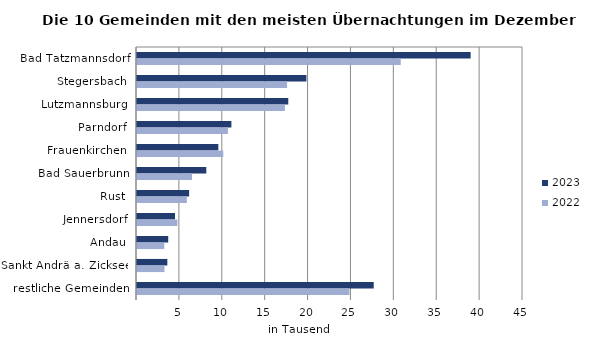
| Category | 2023 | 2022 |
|---|---|---|
| Bad Tatzmannsdorf | 38897 | 30749 |
| Stegersbach | 19749 | 17498 |
| Lutzmannsburg | 17636 | 17246 |
| Parndorf | 11005 | 10603 |
| Frauenkirchen | 9483 | 10058 |
| Bad Sauerbrunn | 8079 | 6413 |
| Rust | 6074 | 5811 |
| Jennersdorf | 4431 | 4710 |
| Andau | 3640 | 3178 |
| Sankt Andrä a. Zicksee | 3538 | 3205 |
| restliche Gemeinden | 27597 | 24765 |